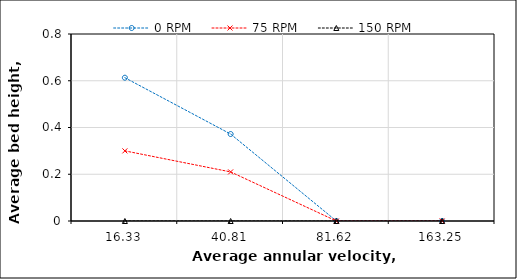
| Category | 0 RPM | 75 RPM | 150 RPM |
|---|---|---|---|
| 16.33 | 0.613 | 0.3 | 0 |
| 40.81 | 0.372 | 0.21 | 0 |
| 81.62 | 0 | 0 | 0 |
| 163.25 | 0 | 0 | 0 |